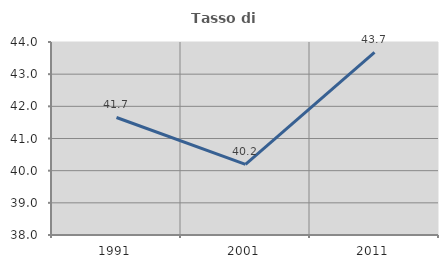
| Category | Tasso di occupazione   |
|---|---|
| 1991.0 | 41.653 |
| 2001.0 | 40.194 |
| 2011.0 | 43.676 |